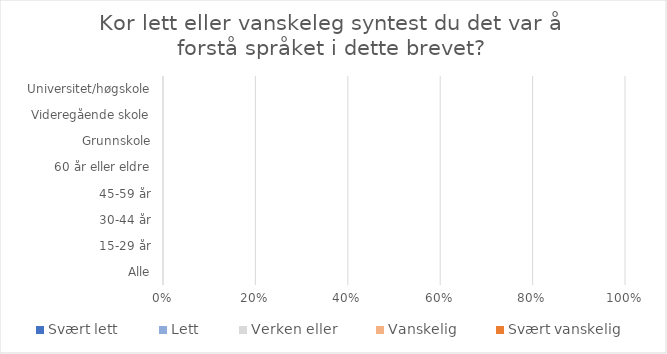
| Category | Svært lett | Lett | Verken eller | Vanskelig | Svært vanskelig |
|---|---|---|---|---|---|
| Alle | 0 | 0 | 0 | 0 | 0 |
| 15-29 år | 0 | 0 | 0 | 0 | 0 |
| 30-44 år | 0 | 0 | 0 | 0 | 0 |
| 45-59 år | 0 | 0 | 0 | 0 | 0 |
| 60 år eller eldre | 0 | 0 | 0 | 0 | 0 |
| Grunnskole | 0 | 0 | 0 | 0 | 0 |
| Videregående skole | 0 | 0 | 0 | 0 | 0 |
| Universitet/høgskole | 0 | 0 | 0 | 0 | 0 |